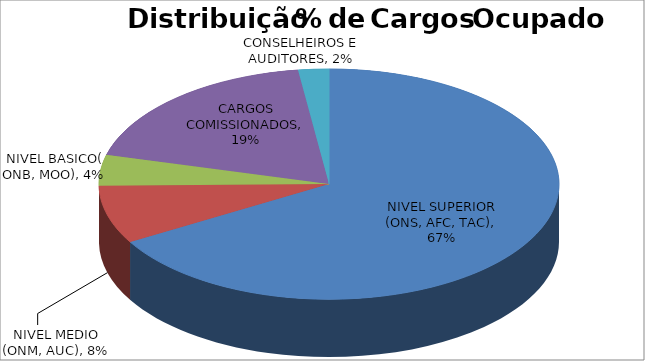
| Category | Series 0 |
|---|---|
| NIVEL SUPERIOR (ONS, AFC, TAC) | 0.666 |
| NIVEL MEDIO (ONM, AUC) | 0.082 |
| NIVEL BASICO( ONB, MOO) | 0.043 |
| CARGOS COMISSIONADOS | 0.188 |
| CONSELHEIROS E AUDITORES | 0.022 |